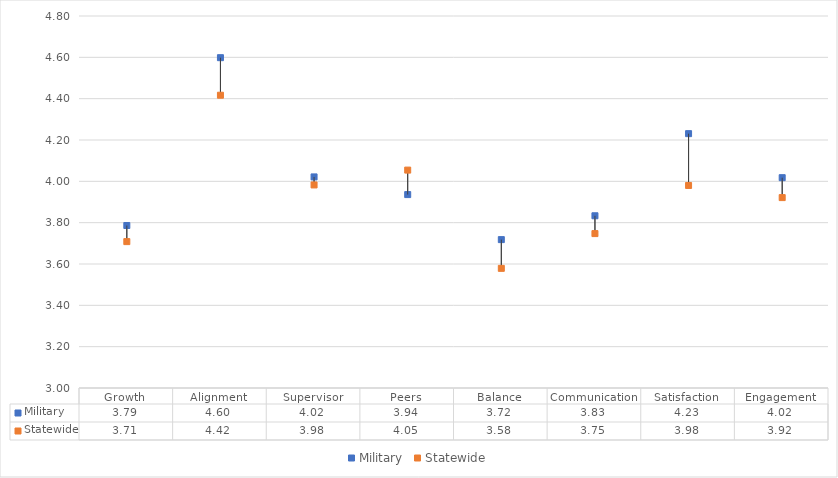
| Category | Military | Statewide |
|---|---|---|
| Growth | 3.786 | 3.708 |
| Alignment | 4.598 | 4.417 |
| Supervisor | 4.021 | 3.983 |
| Peers | 3.936 | 4.054 |
| Balance | 3.718 | 3.579 |
| Communication | 3.833 | 3.747 |
| Satisfaction | 4.231 | 3.98 |
| Engagement | 4.018 | 3.921 |